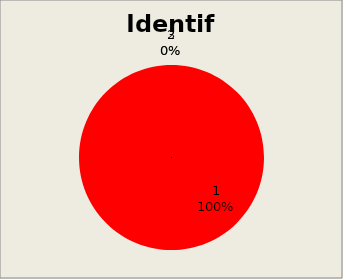
| Category | Series 0 |
|---|---|
| 0 | 29 |
| 1 | 0 |
| 2 | 0 |